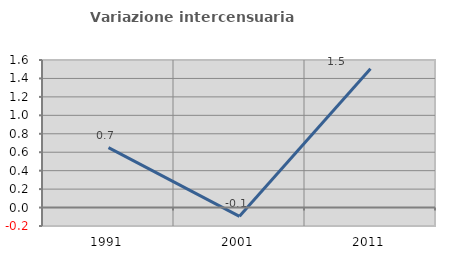
| Category | Variazione intercensuaria annua |
|---|---|
| 1991.0 | 0.65 |
| 2001.0 | -0.095 |
| 2011.0 | 1.506 |